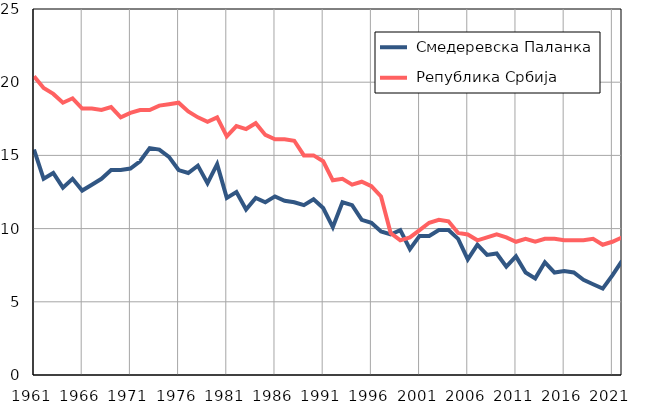
| Category |  Смедеревска Паланка |  Република Србија |
|---|---|---|
| 1961.0 | 15.4 | 20.4 |
| 1962.0 | 13.4 | 19.6 |
| 1963.0 | 13.8 | 19.2 |
| 1964.0 | 12.8 | 18.6 |
| 1965.0 | 13.4 | 18.9 |
| 1966.0 | 12.6 | 18.2 |
| 1967.0 | 13 | 18.2 |
| 1968.0 | 13.4 | 18.1 |
| 1969.0 | 14 | 18.3 |
| 1970.0 | 14 | 17.6 |
| 1971.0 | 14.1 | 17.9 |
| 1972.0 | 14.6 | 18.1 |
| 1973.0 | 15.5 | 18.1 |
| 1974.0 | 15.4 | 18.4 |
| 1975.0 | 14.9 | 18.5 |
| 1976.0 | 14 | 18.6 |
| 1977.0 | 13.8 | 18 |
| 1978.0 | 14.3 | 17.6 |
| 1979.0 | 13.1 | 17.3 |
| 1980.0 | 14.4 | 17.6 |
| 1981.0 | 12.1 | 16.3 |
| 1982.0 | 12.5 | 17 |
| 1983.0 | 11.3 | 16.8 |
| 1984.0 | 12.1 | 17.2 |
| 1985.0 | 11.8 | 16.4 |
| 1986.0 | 12.2 | 16.1 |
| 1987.0 | 11.9 | 16.1 |
| 1988.0 | 11.8 | 16 |
| 1989.0 | 11.6 | 15 |
| 1990.0 | 12 | 15 |
| 1991.0 | 11.4 | 14.6 |
| 1992.0 | 10.1 | 13.3 |
| 1993.0 | 11.8 | 13.4 |
| 1994.0 | 11.6 | 13 |
| 1995.0 | 10.6 | 13.2 |
| 1996.0 | 10.4 | 12.9 |
| 1997.0 | 9.8 | 12.2 |
| 1998.0 | 9.6 | 9.7 |
| 1999.0 | 9.9 | 9.2 |
| 2000.0 | 8.6 | 9.4 |
| 2001.0 | 9.5 | 9.9 |
| 2002.0 | 9.5 | 10.4 |
| 2003.0 | 9.9 | 10.6 |
| 2004.0 | 9.9 | 10.5 |
| 2005.0 | 9.3 | 9.7 |
| 2006.0 | 7.9 | 9.6 |
| 2007.0 | 8.9 | 9.2 |
| 2008.0 | 8.2 | 9.4 |
| 2009.0 | 8.3 | 9.6 |
| 2010.0 | 7.4 | 9.4 |
| 2011.0 | 8.1 | 9.1 |
| 2012.0 | 7 | 9.3 |
| 2013.0 | 6.6 | 9.1 |
| 2014.0 | 7.7 | 9.3 |
| 2015.0 | 7 | 9.3 |
| 2016.0 | 7.1 | 9.2 |
| 2017.0 | 7 | 9.2 |
| 2018.0 | 6.5 | 9.2 |
| 2019.0 | 6.2 | 9.3 |
| 2020.0 | 5.9 | 8.9 |
| 2021.0 | 6.8 | 9.1 |
| 2022.0 | 7.8 | 9.4 |